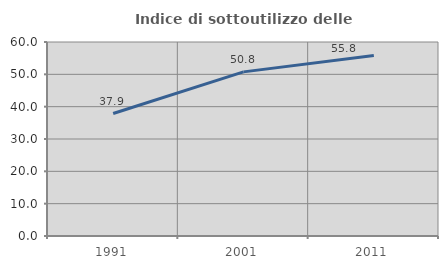
| Category | Indice di sottoutilizzo delle abitazioni  |
|---|---|
| 1991.0 | 37.876 |
| 2001.0 | 50.758 |
| 2011.0 | 55.801 |